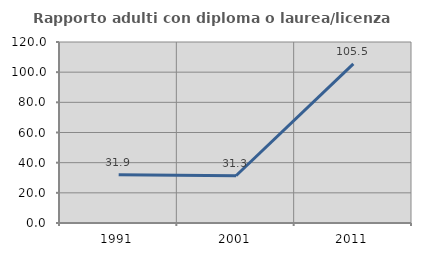
| Category | Rapporto adulti con diploma o laurea/licenza media  |
|---|---|
| 1991.0 | 31.936 |
| 2001.0 | 31.306 |
| 2011.0 | 105.52 |